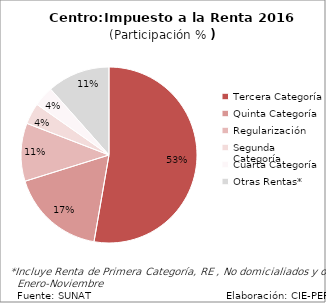
| Category | Series 0 |
|---|---|
| Tercera Categoría | 435.497 |
| Quinta Categoría | 144.181 |
| Regularización | 88.116 |
| Segunda Categoría | 32.176 |
| Cuarta Categoría | 30.589 |
| Otras Rentas* | 95.425 |